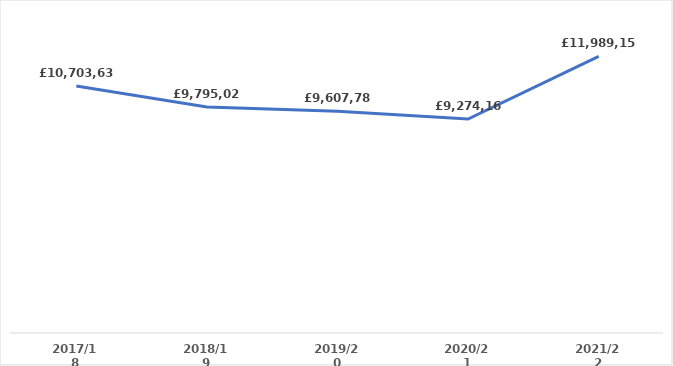
| Category | Series 0 |
|---|---|
| 2017/18 | 10703633.99 |
| 2018/19 | 9795029.35 |
| 2019/20 | 9607781.66 |
| 2020/21 | 9274160.39 |
| 2021/22 | 11989158.71 |